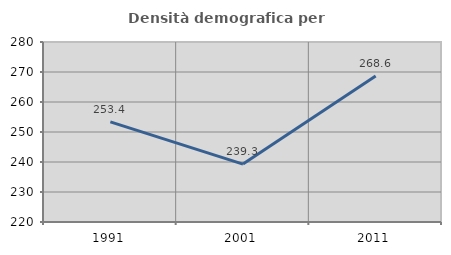
| Category | Densità demografica |
|---|---|
| 1991.0 | 253.37 |
| 2001.0 | 239.294 |
| 2011.0 | 268.639 |